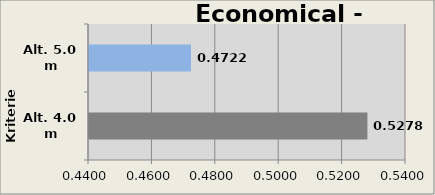
| Category | Bid Sum |
|---|---|
| Alt. 4.0 m | 0.528 |
| Alt. 5.0 m | 0.472 |